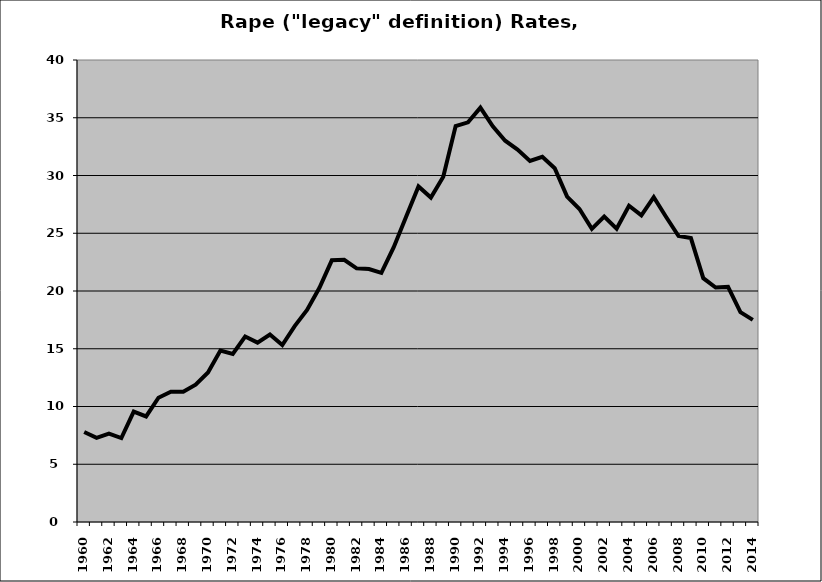
| Category | Rape |
|---|---|
| 1960.0 | 7.792 |
| 1961.0 | 7.282 |
| 1962.0 | 7.652 |
| 1963.0 | 7.269 |
| 1964.0 | 9.563 |
| 1965.0 | 9.137 |
| 1966.0 | 10.76 |
| 1967.0 | 11.275 |
| 1968.0 | 11.276 |
| 1969.0 | 11.892 |
| 1970.0 | 12.948 |
| 1971.0 | 14.846 |
| 1972.0 | 14.557 |
| 1973.0 | 16.063 |
| 1974.0 | 15.532 |
| 1975.0 | 16.236 |
| 1976.0 | 15.323 |
| 1977.0 | 16.959 |
| 1978.0 | 18.361 |
| 1979.0 | 20.282 |
| 1980.0 | 22.657 |
| 1981.0 | 22.702 |
| 1982.0 | 21.964 |
| 1983.0 | 21.901 |
| 1984.0 | 21.573 |
| 1985.0 | 23.789 |
| 1986.0 | 26.426 |
| 1987.0 | 29.05 |
| 1988.0 | 28.088 |
| 1989.0 | 29.889 |
| 1990.0 | 34.276 |
| 1991.0 | 34.6 |
| 1992.0 | 35.876 |
| 1993.0 | 34.255 |
| 1994.0 | 33.013 |
| 1995.0 | 32.245 |
| 1996.0 | 31.258 |
| 1997.0 | 31.623 |
| 1998.0 | 30.625 |
| 1999.0 | 28.167 |
| 2000.0 | 27.095 |
| 2001.0 | 25.384 |
| 2002.0 | 26.439 |
| 2003.0 | 25.4 |
| 2004.0 | 27.387 |
| 2005.0 | 26.544 |
| 2006.0 | 28.126 |
| 2007.0 | 26.41 |
| 2008.0 | 24.764 |
| 2009.0 | 24.582 |
| 2010.0 | 21.111 |
| 2011.0 | 20.298 |
| 2012.0 | 20.352 |
| 2013.0 | 18.175 |
| 2014.0 | 17.498 |